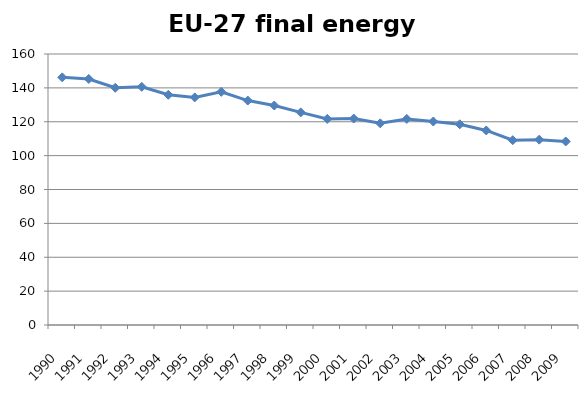
| Category | EU-27 |
|---|---|
| 1990.0 | 146.221 |
| 1991.0 | 145.246 |
| 1992.0 | 140.063 |
| 1993.0 | 140.62 |
| 1994.0 | 135.919 |
| 1995.0 | 134.371 |
| 1996.0 | 137.668 |
| 1997.0 | 132.513 |
| 1998.0 | 129.591 |
| 1999.0 | 125.514 |
| 2000.0 | 121.655 |
| 2001.0 | 121.88 |
| 2002.0 | 119.07 |
| 2003.0 | 121.674 |
| 2004.0 | 120.147 |
| 2005.0 | 118.499 |
| 2006.0 | 114.859 |
| 2007.0 | 109.104 |
| 2008.0 | 109.431 |
| 2009.0 | 108.344 |